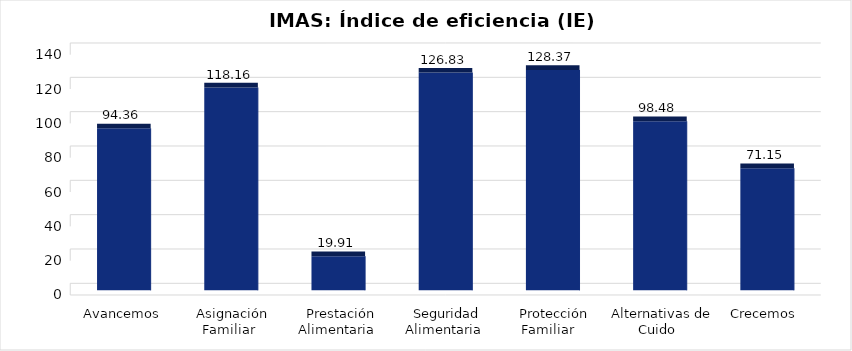
| Category | Índice de eficiencia (IE)  |
|---|---|
| Avancemos | 94.36 |
| Asignación Familiar | 118.159 |
| Prestación Alimentaria | 19.909 |
| Seguridad Alimentaria | 126.832 |
| Protección Familiar  | 128.373 |
| Alternativas de Cuido | 98.483 |
| Crecemos  | 71.146 |